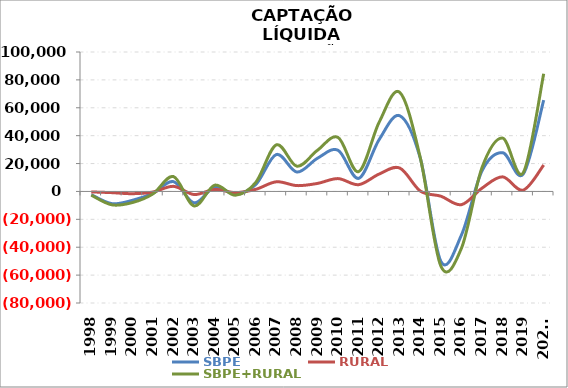
| Category | SBPE | RURAL | SBPE+RURAL |
|---|---|---|---|
| 1998 | -2301.5 | -361.228 | -2662.728 |
| 1999 | -8740.2 | -858.508 | -9598.708 |
| 2000 | -6355.964 | -1615.457 | -7971.421 |
| 2001 | -1319.381 | -412.963 | -1732.344 |
| 2002 | 7008.282 | 3649.972 | 10658.254 |
| 2003 | -8178.886 | -2213.868 | -10392.754 |
| 2004 | 3057.299 | 1425.147 | 4482.446 |
| 2005 | -1869.531 | -826.948 | -2696.479 |
| 2006 | 4963.736 | 1532.919 | 6496.655 |
| 2007 | 26493.6 | 6927.358 | 33420.958 |
| 2008 | 13900.71 | 4187.043 | 18087.753 |
| 2009 | 23813.033 | 5752.651 | 29565.684 |
| 2010 | 29513.472 | 9213.301 | 38726.773 |
| 2011 | 9382.932 | 4844.657 | 14227.589 |
| 2012 | 37239.575 | 12479.984 | 49719.559 |
| 2013 | 54280.749 | 16766.843 | 71047.592 |
| 2014 | 23758.558 | 275.423 | 24033.981 |
| 2015 | -50149.363 | -3418.504 | -53567.867 |
| 2016 | -31222.546 | -9479.207 | -40701.753 |
| 2017 | 14774.799 | 2351.903 | 17126.702 |
| 2018 | 27791.076 | 10469.293 | 38260.369 |
| 2019 | 12389.575 | 937.497 | 13327.072 |
| 2020* | 65494.248 | 18940.503 | 84434.751 |